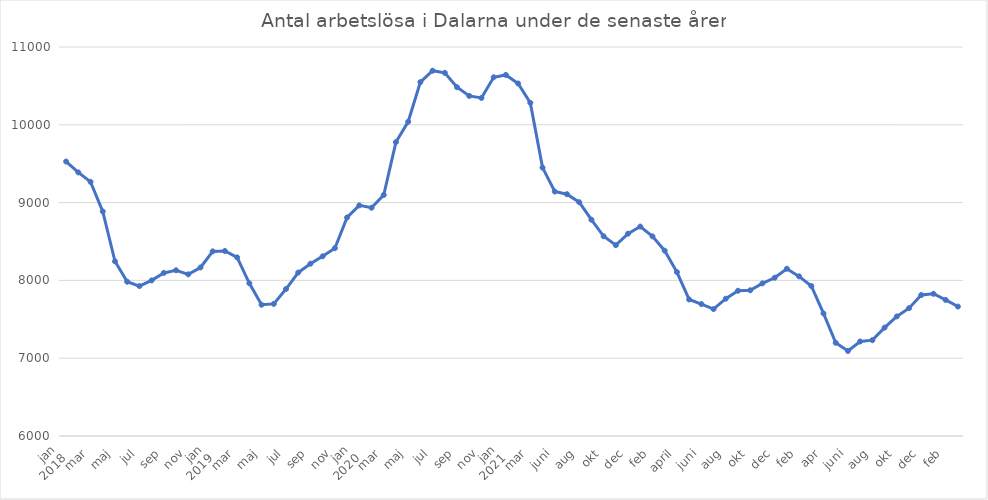
| Category | Series 0 |
|---|---|
| 0 | 9528 |
| 1 | 9388 |
| 2 | 9267 |
| 3 | 8886 |
| 4 | 8246 |
| 5 | 7983 |
| 6 | 7927 |
| 7 | 8000 |
| 8 | 8096 |
| 9 | 8130 |
| 10 | 8078 |
| 11 | 8166 |
| 12 | 8373 |
| 13 | 8378 |
| 14 | 8296 |
| 15 | 7963 |
| 16 | 7687 |
| 17 | 7698 |
| 18 | 7889 |
| 19 | 8101 |
| 20 | 8215 |
| 21 | 8310 |
| 22 | 8414 |
| 23 | 8809 |
| 24 | 8964 |
| 25 | 8934 |
| 26 | 9098 |
| 27 | 9778 |
| 28 | 10039 |
| 29 | 10549 |
| 30 | 10695 |
| 31 | 10668 |
| 32 | 10483 |
| 33 | 10371 |
| 34 | 10345 |
| 35 | 10611 |
| 36 | 10641 |
| 37 | 10531 |
| 38 | 10282 |
| 39 | 9450 |
| 40 | 9142 |
| 41 | 9108 |
| 42 | 9005 |
| 43 | 8780 |
| 44 | 8567 |
| 45 | 8453 |
| 46 | 8601 |
| 47 | 8692 |
| 48 | 8566 |
| 49 | 8382 |
| 50 | 8107 |
| 51 | 7755 |
| 52 | 7696 |
| 53 | 7631 |
| 54 | 7765 |
| 55 | 7867 |
| 56 | 7873 |
| 57 | 7962 |
| 58 | 8034 |
| 59 | 8150 |
| 60 | 8052 |
| 61 | 7928 |
| 62 | 7575 |
| 63 | 7198 |
| 64 | 7093 |
| 65 | 7215 |
| 66 | 7232 |
| 67 | 7393 |
| 68 | 7537 |
| 69 | 7643 |
| 70 | 7812 |
| 71 | 7828 |
| 72 | 7749 |
| 73 | 7664 |